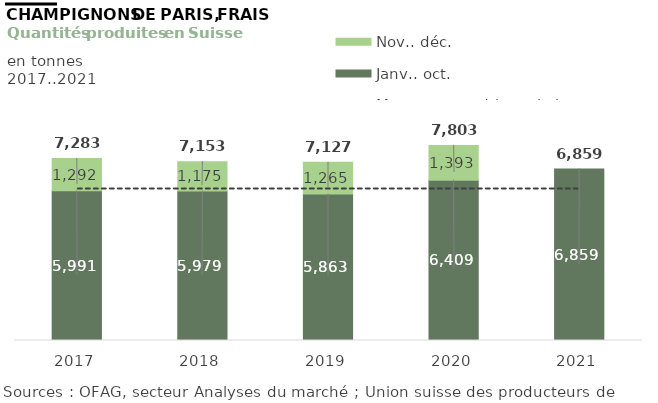
| Category | Janv.. oct. | Nov.. déc. |
|---|---|---|
| 2017 | 5990.974 | 1291.863 |
| 2018 | 5978.717 | 1174.681 |
| 2019 | 5862.522 | 1264.582 |
| 2020 | 6409.093 | 1393.458 |
| 2021 | 6859.492 | 0 |